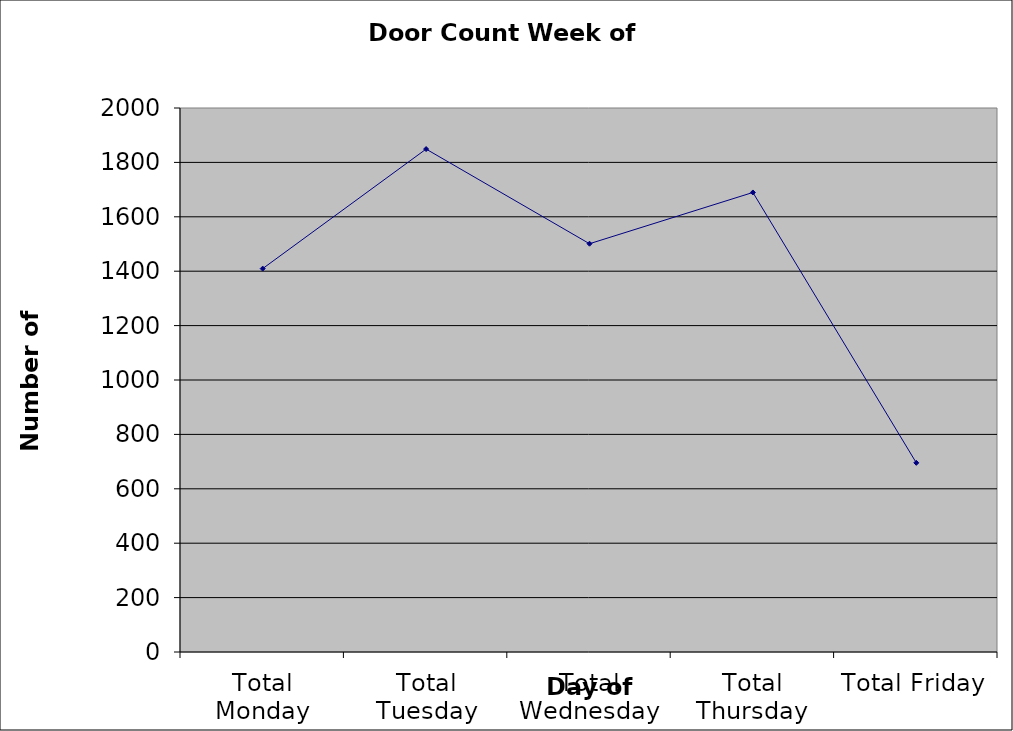
| Category | Series 0 |
|---|---|
| Total Monday | 1409.5 |
| Total Tuesday | 1849 |
| Total Wednesday | 1501 |
| Total Thursday | 1689.5 |
| Total Friday | 695.5 |